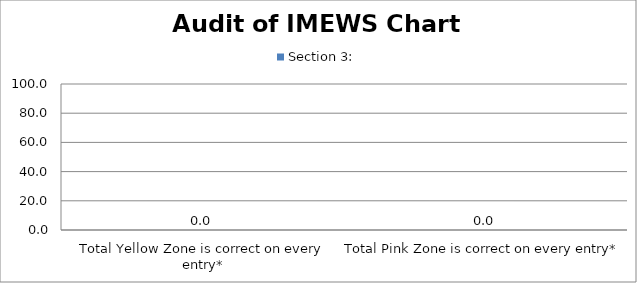
| Category | Section 3: |
|---|---|
| Total Yellow Zone is correct on every entry* | 0 |
| Total Pink Zone is correct on every entry* | 0 |